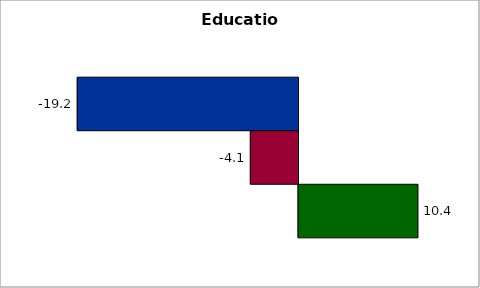
| Category | 50 states and D.C. | SREB states | State |
|---|---|---|---|
| 0 | -19.196 | -4.145 | 10.39 |